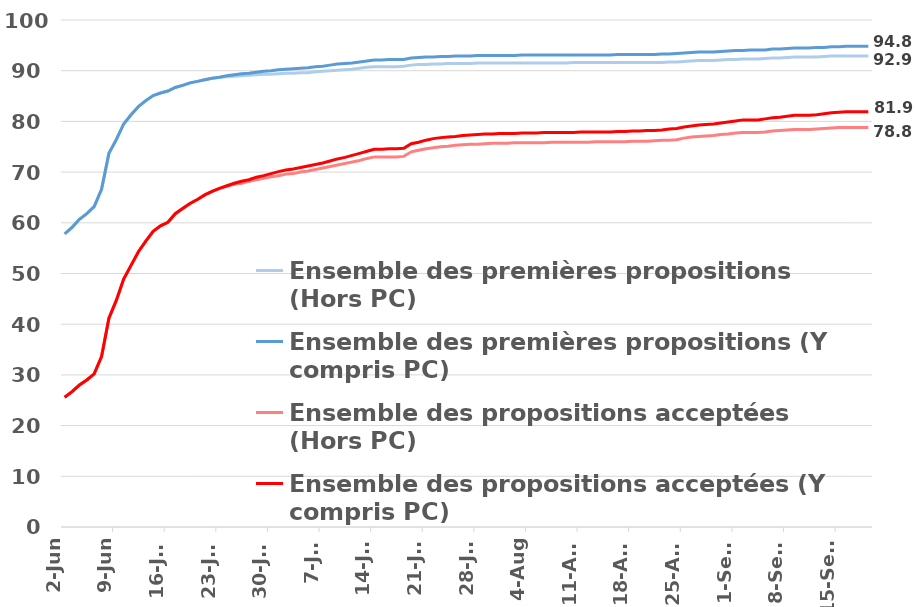
| Category | Ensemble des premières propositions (Hors PC) | Ensemble des premières propositions (Y compris PC) | Ensemble des propositions acceptées (Hors PC) | Ensemble des propositions acceptées (Y compris PC) |
|---|---|---|---|---|
| 2022-06-02 | 57.8 | 57.8 | 25.6 | 25.6 |
| 2022-06-03 | 59.1 | 59.1 | 26.7 | 26.7 |
| 2022-06-04 | 60.7 | 60.7 | 28 | 28 |
| 2022-06-05 | 61.8 | 61.8 | 29 | 29 |
| 2022-06-06 | 63.2 | 63.2 | 30.2 | 30.2 |
| 2022-06-07 | 66.6 | 66.6 | 33.6 | 33.6 |
| 2022-06-08 | 73.7 | 73.7 | 41.2 | 41.2 |
| 2022-06-09 | 76.4 | 76.4 | 44.7 | 44.7 |
| 2022-06-10 | 79.5 | 79.5 | 48.9 | 48.9 |
| 2022-06-11 | 81.3 | 81.3 | 51.6 | 51.6 |
| 2022-06-12 | 82.9 | 82.9 | 54.3 | 54.3 |
| 2022-06-13 | 84.1 | 84.1 | 56.4 | 56.4 |
| 2022-06-14 | 85.1 | 85.1 | 58.3 | 58.3 |
| 2022-06-15 | 85.6 | 85.6 | 59.4 | 59.4 |
| 2022-06-16 | 86 | 86 | 60.1 | 60.1 |
| 2022-06-17 | 86.7 | 86.7 | 61.8 | 61.8 |
| 2022-06-18 | 87.1 | 87.1 | 62.8 | 62.8 |
| 2022-06-19 | 87.6 | 87.6 | 63.8 | 63.8 |
| 2022-06-20 | 87.9 | 87.9 | 64.6 | 64.6 |
| 2022-06-21 | 88.2 | 88.2 | 65.5 | 65.5 |
| 2022-06-22 | 88.5 | 88.5 | 66.2 | 66.2 |
| 2022-06-23 | 88.7 | 88.7 | 66.8 | 66.8 |
| 2022-06-24 | 88.8 | 89 | 67.2 | 67.3 |
| 2022-06-25 | 88.9 | 89.2 | 67.6 | 67.8 |
| 2022-06-26 | 89 | 89.4 | 67.8 | 68.2 |
| 2022-06-27 | 89.1 | 89.5 | 68.2 | 68.5 |
| 2022-06-28 | 89.2 | 89.7 | 68.5 | 69 |
| 2022-06-29 | 89.3 | 89.9 | 68.8 | 69.3 |
| 2022-06-30 | 89.3 | 90 | 69.1 | 69.7 |
| 2022-07-01 | 89.4 | 90.2 | 69.3 | 70.1 |
| 2022-07-02 | 89.5 | 90.3 | 69.6 | 70.4 |
| 2022-07-03 | 89.5 | 90.4 | 69.7 | 70.6 |
| 2022-07-04 | 89.6 | 90.5 | 70 | 70.9 |
| 2022-07-05 | 89.6 | 90.6 | 70.2 | 71.2 |
| 2022-07-06 | 89.8 | 90.8 | 70.5 | 71.5 |
| 2022-07-07 | 89.9 | 90.9 | 70.8 | 71.8 |
| 2022-07-08 | 90 | 91.1 | 71.1 | 72.2 |
| 2022-07-09 | 90.1 | 91.3 | 71.4 | 72.6 |
| 2022-07-10 | 90.2 | 91.4 | 71.7 | 72.9 |
| 2022-07-11 | 90.3 | 91.5 | 72 | 73.3 |
| 2022-07-12 | 90.5 | 91.7 | 72.3 | 73.7 |
| 2022-07-13 | 90.7 | 91.9 | 72.7 | 74.1 |
| 2022-07-14 | 90.8 | 92.1 | 73 | 74.5 |
| 2022-07-15 | 90.8 | 92.1 | 73 | 74.5 |
| 2022-07-16 | 90.8 | 92.2 | 73 | 74.6 |
| 2022-07-17 | 90.8 | 92.2 | 73 | 74.6 |
| 2022-07-18 | 90.9 | 92.2 | 73.1 | 74.7 |
| 2022-07-19 | 91.1 | 92.5 | 74 | 75.6 |
| 2022-07-20 | 91.2 | 92.6 | 74.3 | 75.9 |
| 2022-07-21 | 91.2 | 92.7 | 74.6 | 76.3 |
| 2022-07-22 | 91.3 | 92.7 | 74.8 | 76.6 |
| 2022-07-23 | 91.3 | 92.8 | 75 | 76.8 |
| 2022-07-24 | 91.4 | 92.8 | 75.1 | 76.9 |
| 2022-07-25 | 91.4 | 92.9 | 75.3 | 77 |
| 2022-07-26 | 91.4 | 92.9 | 75.4 | 77.2 |
| 2022-07-27 | 91.4 | 92.9 | 75.5 | 77.3 |
| 2022-07-28 | 91.5 | 93 | 75.5 | 77.4 |
| 2022-07-29 | 91.5 | 93 | 75.6 | 77.5 |
| 2022-07-30 | 91.5 | 93 | 75.7 | 77.5 |
| 2022-07-31 | 91.5 | 93 | 75.7 | 77.6 |
| 2022-08-01 | 91.5 | 93 | 75.7 | 77.6 |
| 2022-08-02 | 91.5 | 93 | 75.8 | 77.6 |
| 2022-08-03 | 91.5 | 93.1 | 75.8 | 77.7 |
| 2022-08-04 | 91.5 | 93.1 | 75.8 | 77.7 |
| 2022-08-05 | 91.5 | 93.1 | 75.8 | 77.7 |
| 2022-08-06 | 91.5 | 93.1 | 75.8 | 77.8 |
| 2022-08-07 | 91.5 | 93.1 | 75.9 | 77.8 |
| 2022-08-08 | 91.5 | 93.1 | 75.9 | 77.8 |
| 2022-08-09 | 91.5 | 93.1 | 75.9 | 77.8 |
| 2022-08-10 | 91.6 | 93.1 | 75.9 | 77.8 |
| 2022-08-11 | 91.6 | 93.1 | 75.9 | 77.9 |
| 2022-08-12 | 91.6 | 93.1 | 75.9 | 77.9 |
| 2022-08-13 | 91.6 | 93.1 | 76 | 77.9 |
| 2022-08-14 | 91.6 | 93.1 | 76 | 77.9 |
| 2022-08-15 | 91.6 | 93.1 | 76 | 77.9 |
| 2022-08-16 | 91.6 | 93.2 | 76 | 78 |
| 2022-08-17 | 91.6 | 93.2 | 76 | 78 |
| 2022-08-18 | 91.6 | 93.2 | 76.1 | 78.1 |
| 2022-08-19 | 91.6 | 93.2 | 76.1 | 78.1 |
| 2022-08-20 | 91.6 | 93.2 | 76.1 | 78.2 |
| 2022-08-21 | 91.6 | 93.2 | 76.2 | 78.2 |
| 2022-08-22 | 91.6 | 93.3 | 76.3 | 78.3 |
| 2022-08-23 | 91.7 | 93.3 | 76.3 | 78.5 |
| 2022-08-24 | 91.7 | 93.4 | 76.4 | 78.6 |
| 2022-08-25 | 91.8 | 93.5 | 76.7 | 78.9 |
| 2022-08-26 | 91.9 | 93.6 | 76.9 | 79.1 |
| 2022-08-27 | 92 | 93.7 | 77 | 79.3 |
| 2022-08-28 | 92 | 93.7 | 77.1 | 79.4 |
| 2022-08-29 | 92 | 93.7 | 77.2 | 79.5 |
| 2022-08-30 | 92.1 | 93.8 | 77.4 | 79.7 |
| 2022-08-31 | 92.2 | 93.9 | 77.5 | 79.9 |
| 2022-09-01 | 92.2 | 94 | 77.7 | 80.1 |
| 2022-09-02 | 92.3 | 94 | 77.8 | 80.3 |
| 2022-09-03 | 92.3 | 94.1 | 77.8 | 80.3 |
| 2022-09-04 | 92.3 | 94.1 | 77.8 | 80.3 |
| 2022-09-05 | 92.4 | 94.1 | 77.9 | 80.5 |
| 2022-09-06 | 92.5 | 94.3 | 78.1 | 80.7 |
| 2022-09-07 | 92.5 | 94.3 | 78.2 | 80.8 |
| 2022-09-08 | 92.6 | 94.4 | 78.3 | 81 |
| 2022-09-09 | 92.7 | 94.5 | 78.4 | 81.2 |
| 2022-09-10 | 92.7 | 94.5 | 78.4 | 81.2 |
| 2022-09-11 | 92.7 | 94.5 | 78.4 | 81.2 |
| 2022-09-12 | 92.7 | 94.6 | 78.5 | 81.3 |
| 2022-09-13 | 92.8 | 94.6 | 78.6 | 81.5 |
| 2022-09-14 | 92.9 | 94.7 | 78.7 | 81.7 |
| 2022-09-15 | 92.9 | 94.7 | 78.8 | 81.8 |
| 2022-09-16 | 92.9 | 94.8 | 78.8 | 81.9 |
| 2022-09-17 | 92.9 | 94.8 | 78.8 | 81.9 |
| 2022-09-18 | 92.9 | 94.8 | 78.8 | 81.9 |
| 2022-09-19 | 92.9 | 94.8 | 78.8 | 81.9 |